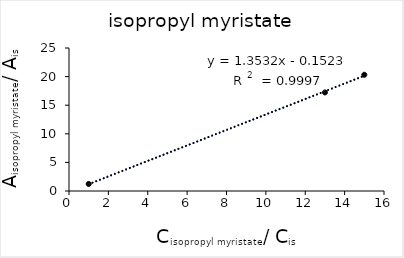
| Category | Series 0 |
|---|---|
| 1.0 | 1.23 |
| 13.0 | 17.236 |
| 15.0 | 20.32 |